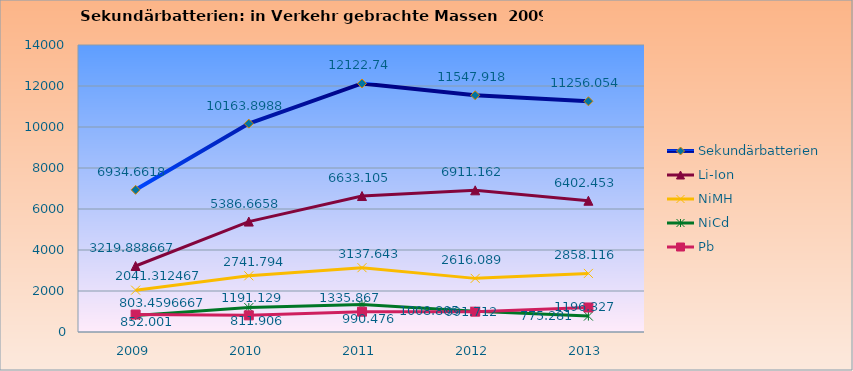
| Category | Sekundärbatterien | Li-Ion | NiMH | NiCd | Pb |
|---|---|---|---|---|---|
| 2009.0 | 6934.662 | 3219.889 | 2041.312 | 803.46 | 852.001 |
| 2010.0 | 10163.899 | 5386.666 | 2741.794 | 1191.129 | 811.906 |
| 2011.0 | 12122.74 | 6633.105 | 3137.643 | 1335.867 | 990.476 |
| 2012.0 | 11547.918 | 6911.162 | 2616.089 | 1008.805 | 991.712 |
| 2013.0 | 11256.054 | 6402.453 | 2858.116 | 775.281 | 1196.327 |